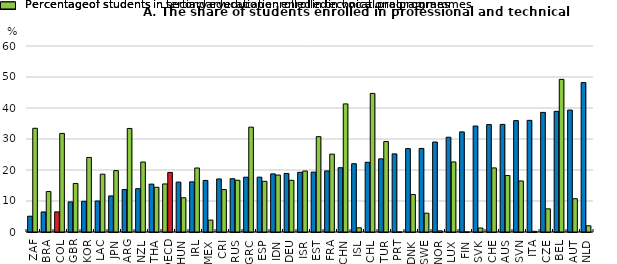
| Category | Percentage of students in secondary education enrolled in vocational programmes | Percentage of students in tertiary education enrolled in technical programmes |
|---|---|---|
| ZAF | 5.089 | 33.46 |
| BRA | 6.469 | 13.049 |
| COL | 6.496 | 31.798 |
| GBR | 9.7 | 15.658 |
| KOR | 9.905 | 24.052 |
| LAC | 10.001 | 18.655 |
| JPN | 11.642 | 19.796 |
| ARG | 13.7 | 33.4 |
| NZL | 13.97 | 22.58 |
| THA | 15.445 | 14.43 |
| OECD | 15.5 | 19.213 |
| HUN | 16.095 | 11.043 |
| IRL | 16.177 | 20.649 |
| MEX | 16.633 | 3.848 |
| CRI | 17.111 | 13.688 |
| RUS | 17.191 | 16.689 |
| GRC | 17.675 | 33.822 |
| ESP | 17.689 | 16.349 |
| IDN | 18.741 | 18.366 |
| DEU | 18.888 | 16.682 |
| ISR | 19.245 | 19.667 |
| EST | 19.31 | 30.753 |
| FRA | 19.697 | 25.113 |
| CHN | 20.732 | 41.329 |
| ISL | 22.028 | 1.356 |
| CHL | 22.486 | 44.703 |
| TUR | 23.59 | 29.18 |
| PRT | 25.198 | 0.019 |
| DNK | 26.907 | 12.083 |
| SWE | 26.953 | 6.065 |
| NOR | 29.032 | 0.366 |
| LUX | 30.574 | 22.597 |
| FIN | 32.296 | 0.027 |
| SVK | 34.191 | 1.289 |
| CHE | 34.652 | 20.669 |
| AUS | 34.712 | 18.213 |
| SVN | 35.935 | 16.465 |
| ITA | 36.017 | 0.221 |
| CZE | 38.587 | 7.467 |
| BEL | 38.913 | 49.238 |
| AUT | 39.336 | 10.74 |
| NLD | 48.196 | 2.001 |